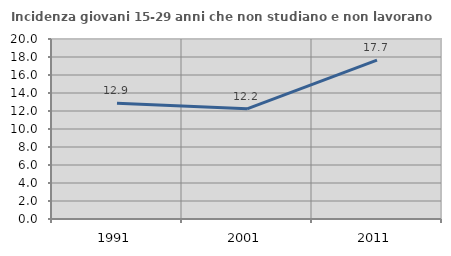
| Category | Incidenza giovani 15-29 anni che non studiano e non lavorano  |
|---|---|
| 1991.0 | 12.851 |
| 2001.0 | 12.246 |
| 2011.0 | 17.656 |